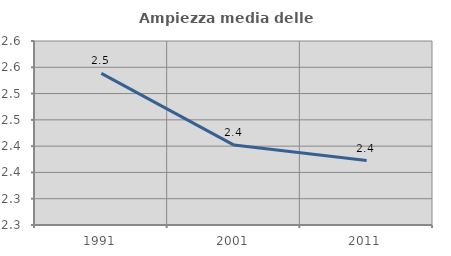
| Category | Ampiezza media delle famiglie |
|---|---|
| 1991.0 | 2.538 |
| 2001.0 | 2.402 |
| 2011.0 | 2.373 |